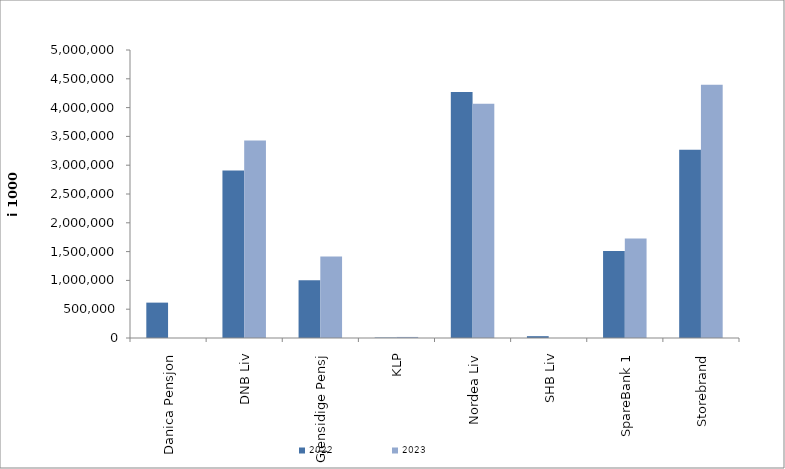
| Category | 2022 | 2023 |
|---|---|---|
| Danica Pensjon | 614205.692 | 0 |
| DNB Liv | 2905848.01 | 3430435.716 |
| Gjensidige Pensj | 1002999 | 1416253 |
| KLP | 7778.818 | 18550.222 |
| Nordea Liv | 4270850.294 | 4065856.854 |
| SHB Liv | 31910.575 | 0 |
| SpareBank 1 | 1509638.102 | 1726963.186 |
| Storebrand | 3267123.504 | 4395415.706 |